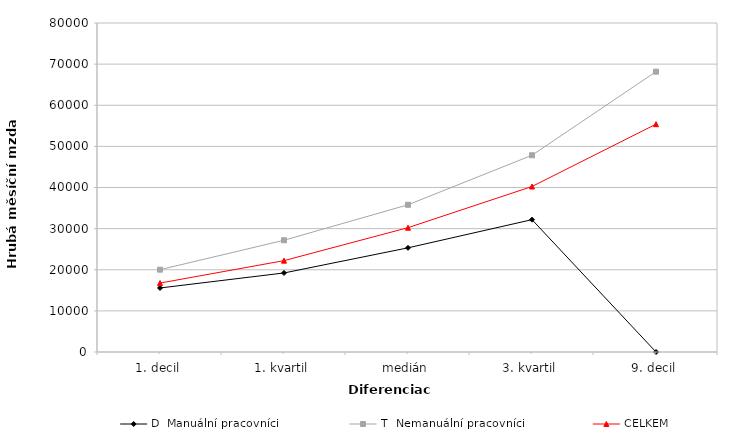
| Category | D  Manuální pracovníci | T  Nemanuální pracovníci | CELKEM |
|---|---|---|---|
| 1. decil | 15566.224 | 20017.131 | 16761.167 |
| 1. kvartil | 19220.595 | 27172.674 | 22218.317 |
| medián | 25326.777 | 35794.162 | 30230.163 |
| 3. kvartil | 32178.29 | 47841.791 | 40242.995 |
| 9. decil | 0 | 68168.545 | 55400.161 |